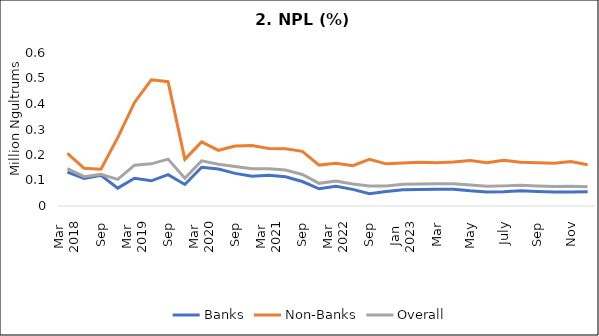
| Category | Banks | Non-Banks | Overall |
|---|---|---|---|
| 0 | 0.133 | 0.207 | 0.146 |
| 1 | 0.108 | 0.148 | 0.115 |
| 2 | 0.12 | 0.144 | 0.124 |
| 3 | 0.07 | 0.268 | 0.104 |
| 4 | 0.109 | 0.406 | 0.16 |
| 5 | 0.099 | 0.495 | 0.165 |
| 6 | 0.123 | 0.487 | 0.184 |
| 7 | 0.084 | 0.183 | 0.109 |
| 8 | 0.152 | 0.251 | 0.177 |
| 9 | 0.145 | 0.218 | 0.164 |
| 10 | 0.128 | 0.235 | 0.154 |
| 11 | 0.117 | 0.237 | 0.146 |
| 12 | 0.121 | 0.226 | 0.146 |
| 13 | 0.115 | 0.224 | 0.141 |
| 14 | 0.096 | 0.214 | 0.124 |
| 15 | 0.067 | 0.16 | 0.089 |
| 16 | 0.077 | 0.168 | 0.098 |
| 17 | 0.065 | 0.158 | 0.086 |
| 18 | 0.048 | 0.183 | 0.078 |
| 19 | 0.057 | 0.165 | 0.079 |
| 20 | 0.063 | 0.169 | 0.085 |
| 21 | 0.065 | 0.171 | 0.086 |
| 22 | 0.066 | 0.169 | 0.087 |
| 23 | 0.066 | 0.173 | 0.087 |
| 24 | 0.06 | 0.178 | 0.082 |
| 25 | 0.055 | 0.17 | 0.077 |
| 26 | 0.056 | 0.179 | 0.079 |
| 27 | 0.06 | 0.172 | 0.081 |
| 28 | 0.057 | 0.17 | 0.079 |
| 29 | 0.055 | 0.167 | 0.077 |
| 30 | 0.055 | 0.174 | 0.077 |
| 31 | 0.055 | 0.162 | 0.075 |